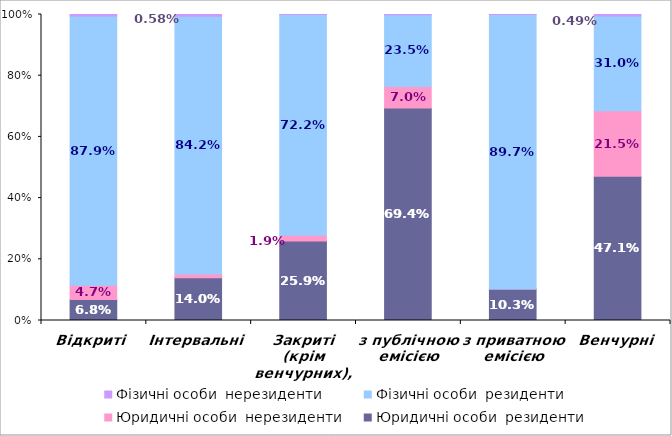
| Category | Юридичні особи  | Фізичні особи  |
|---|---|---|
| Відкриті | 0.047 | 0.005 |
| Інтервальні | 0.012 | 0.006 |
| Закриті (крім венчурних), у т. ч.: | 0.019 | 0 |
| з публічною емісією | 0.07 | 0.001 |
| з приватною емісією | 0 | 0 |
| Венчурні | 0.215 | 0.005 |